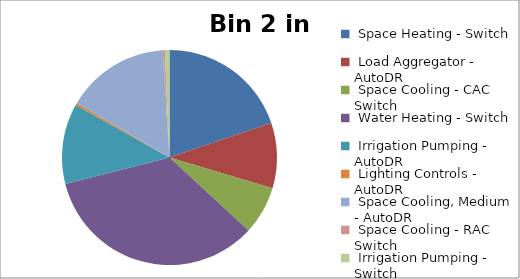
| Category | Series 0 |
|---|---|
|  Space Heating - Switch | 0.071 |
|  Load Aggregator - AutoDR | 0.035 |
|  Space Cooling - CAC Switch | 0.026 |
|  Water Heating - Switch | 0.123 |
|  Irrigation Pumping - AutoDR | 0.043 |
|  Lighting Controls - AutoDR | 0.001 |
|  Space Cooling, Medium - AutoDR | 0.056 |
|  Space Cooling - RAC Switch | 0.001 |
|  Irrigation Pumping - Switch | 0.002 |